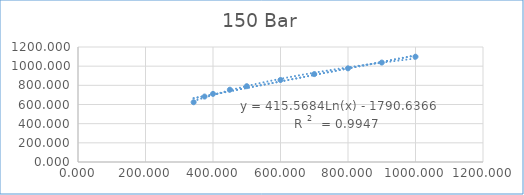
| Category | Series 0 |
|---|---|
| 342.6 | 623.674 |
| 375.0 | 682.967 |
| 400.0 | 710.87 |
| 450.0 | 754.396 |
| 500.0 | 790.922 |
| 600.0 | 855.972 |
| 700.0 | 917.129 |
| 800.0 | 977.329 |
| 900.0 | 1037.673 |
| 1000.0 | 1098.71 |